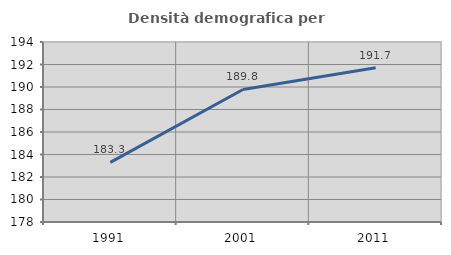
| Category | Densità demografica |
|---|---|
| 1991.0 | 183.299 |
| 2001.0 | 189.783 |
| 2011.0 | 191.707 |